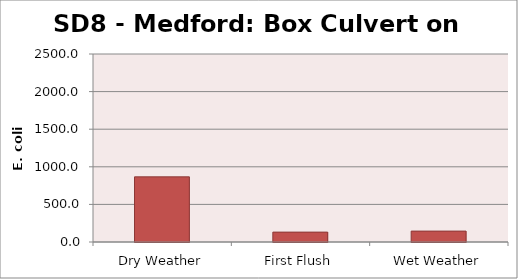
| Category | E. coli MPN |
|---|---|
| Dry Weather | 866.4 |
| First Flush | 131.4 |
| Wet Weather | 145 |